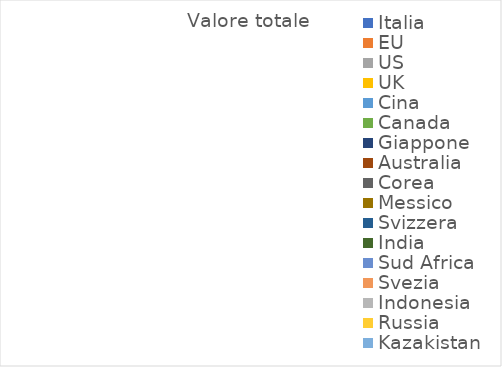
| Category | Valore totale |
|---|---|
| Italia | 0 |
| EU | 0 |
| US | 0 |
| UK | 0 |
| Cina | 0 |
| Canada | 0 |
| Giappone | 0 |
| Australia | 0 |
| Corea | 0 |
| Messico | 0 |
| Svizzera | 0 |
| India | 0 |
| Sud Africa | 0 |
| Svezia | 0 |
| Indonesia | 0 |
| Russia | 0 |
| Kazakistan | 0 |